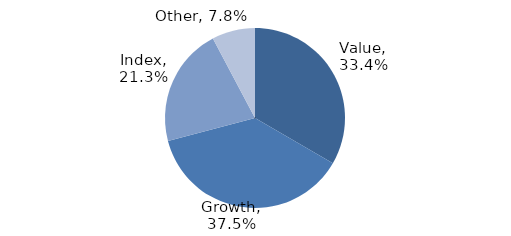
| Category | Investment Style |
|---|---|
| Value | 0.334 |
| Growth | 0.375 |
| Index | 0.213 |
| Other | 0.078 |